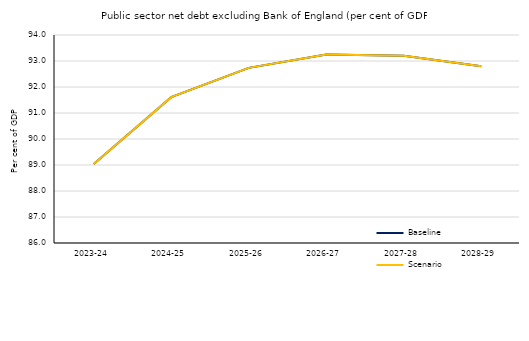
| Category | Baseline | Scenario |
|---|---|---|
| 2023-24 | 89.038 | 89.038 |
| 2024-25 | 91.61 | 91.61 |
| 2025-26 | 92.735 | 92.735 |
| 2026-27 | 93.247 | 93.247 |
| 2027-28 | 93.198 | 93.198 |
| 2028-29 | 92.802 | 92.802 |